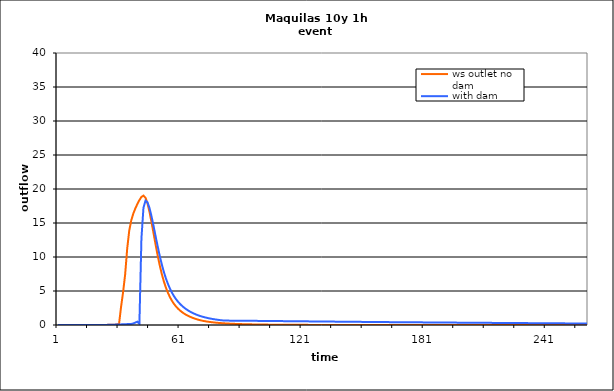
| Category | ws outlet no dam | with dam |
|---|---|---|
| 0 | 0 | 0 |
| 1 | 0 | 0 |
| 2 | 0 | 0 |
| 3 | 0 | 0 |
| 4 | 0 | 0 |
| 5 | 0 | 0 |
| 6 | 0 | 0 |
| 7 | 0 | 0 |
| 8 | 0 | 0 |
| 9 | 0 | 0 |
| 10 | 0 | 0 |
| 11 | 0 | 0 |
| 12 | 0 | 0 |
| 13 | 0 | 0 |
| 14 | 0 | 0 |
| 15 | 0 | 0 |
| 16 | 0 | 0 |
| 17 | 0 | 0 |
| 18 | 0 | 0 |
| 19 | 0 | 0 |
| 20 | 0 | 0 |
| 21 | 0 | 0 |
| 22 | 0.003 | 0.003 |
| 23 | 0.009 | 0.009 |
| 24 | 0.017 | 0.016 |
| 25 | 0.025 | 0.025 |
| 26 | 0.035 | 0.034 |
| 27 | 0.045 | 0.044 |
| 28 | 0.039 | 0.054 |
| 29 | 0.092 | 0.065 |
| 30 | 0.186 | 0.077 |
| 31 | 2.692 | 0.09 |
| 32 | 4.859 | 0.103 |
| 33 | 7.443 | 0.117 |
| 34 | 11.21 | 0.131 |
| 35 | 13.874 | 0.144 |
| 36 | 15.387 | 0.154 |
| 37 | 16.379 | 0.227 |
| 38 | 17.142 | 0.354 |
| 39 | 17.79 | 0.483 |
| 40 | 18.369 | 0.187 |
| 41 | 18.832 | 12.726 |
| 42 | 19.026 | 17.243 |
| 43 | 18.719 | 18.287 |
| 44 | 17.86 | 18.037 |
| 45 | 16.591 | 17.164 |
| 46 | 15.058 | 15.925 |
| 47 | 13.41 | 14.495 |
| 48 | 11.759 | 13.004 |
| 49 | 10.188 | 11.539 |
| 50 | 8.761 | 10.164 |
| 51 | 7.506 | 8.923 |
| 52 | 6.428 | 7.828 |
| 53 | 5.522 | 6.874 |
| 54 | 4.755 | 6.057 |
| 55 | 4.105 | 5.357 |
| 56 | 3.561 | 4.756 |
| 57 | 3.106 | 4.24 |
| 58 | 2.724 | 3.798 |
| 59 | 2.398 | 3.418 |
| 60 | 2.122 | 3.09 |
| 61 | 1.883 | 2.804 |
| 62 | 1.674 | 2.55 |
| 63 | 1.492 | 2.326 |
| 64 | 1.338 | 2.128 |
| 65 | 1.2 | 1.953 |
| 66 | 1.076 | 1.795 |
| 67 | 0.963 | 1.653 |
| 68 | 0.861 | 1.524 |
| 69 | 0.772 | 1.41 |
| 70 | 0.695 | 1.31 |
| 71 | 0.628 | 1.22 |
| 72 | 0.569 | 1.139 |
| 73 | 0.518 | 1.066 |
| 74 | 0.472 | 0.999 |
| 75 | 0.431 | 0.939 |
| 76 | 0.395 | 0.884 |
| 77 | 0.362 | 0.833 |
| 78 | 0.332 | 0.787 |
| 79 | 0.306 | 0.745 |
| 80 | 0.282 | 0.706 |
| 81 | 0.26 | 0.676 |
| 82 | 0.24 | 0.657 |
| 83 | 0.222 | 0.648 |
| 84 | 0.206 | 0.643 |
| 85 | 0.191 | 0.641 |
| 86 | 0.177 | 0.638 |
| 87 | 0.165 | 0.636 |
| 88 | 0.153 | 0.633 |
| 89 | 0.142 | 0.631 |
| 90 | 0.132 | 0.628 |
| 91 | 0.123 | 0.625 |
| 92 | 0.115 | 0.623 |
| 93 | 0.107 | 0.62 |
| 94 | 0.1 | 0.617 |
| 95 | 0.094 | 0.615 |
| 96 | 0.088 | 0.612 |
| 97 | 0.082 | 0.609 |
| 98 | 0.077 | 0.606 |
| 99 | 0.072 | 0.603 |
| 100 | 0.068 | 0.601 |
| 101 | 0.063 | 0.598 |
| 102 | 0.06 | 0.595 |
| 103 | 0.056 | 0.592 |
| 104 | 0.053 | 0.589 |
| 105 | 0.05 | 0.586 |
| 106 | 0.047 | 0.583 |
| 107 | 0.044 | 0.58 |
| 108 | 0.041 | 0.577 |
| 109 | 0.039 | 0.574 |
| 110 | 0.037 | 0.572 |
| 111 | 0.035 | 0.569 |
| 112 | 0.033 | 0.566 |
| 113 | 0.031 | 0.563 |
| 114 | 0.03 | 0.56 |
| 115 | 0.028 | 0.557 |
| 116 | 0.026 | 0.554 |
| 117 | 0.025 | 0.551 |
| 118 | 0.024 | 0.548 |
| 119 | 0.023 | 0.545 |
| 120 | 0.021 | 0.542 |
| 121 | 0.02 | 0.539 |
| 122 | 0.019 | 0.537 |
| 123 | 0.018 | 0.534 |
| 124 | 0.017 | 0.531 |
| 125 | 0.017 | 0.528 |
| 126 | 0.016 | 0.525 |
| 127 | 0.015 | 0.522 |
| 128 | 0.014 | 0.519 |
| 129 | 0.014 | 0.516 |
| 130 | 0.013 | 0.513 |
| 131 | 0.012 | 0.51 |
| 132 | 0.012 | 0.508 |
| 133 | 0.011 | 0.505 |
| 134 | 0.011 | 0.502 |
| 135 | 0.01 | 0.499 |
| 136 | 0.01 | 0.496 |
| 137 | 0.009 | 0.493 |
| 138 | 0.009 | 0.49 |
| 139 | 0.008 | 0.488 |
| 140 | 0.008 | 0.485 |
| 141 | 0.007 | 0.482 |
| 142 | 0.007 | 0.479 |
| 143 | 0.006 | 0.476 |
| 144 | 0.006 | 0.474 |
| 145 | 0.005 | 0.471 |
| 146 | 0.005 | 0.468 |
| 147 | 0.005 | 0.465 |
| 148 | 0.004 | 0.462 |
| 149 | 0.004 | 0.46 |
| 150 | 0.004 | 0.457 |
| 151 | 0.003 | 0.454 |
| 152 | 0.003 | 0.451 |
| 153 | 0.003 | 0.449 |
| 154 | 0.003 | 0.446 |
| 155 | 0.002 | 0.443 |
| 156 | 0.002 | 0.44 |
| 157 | 0.002 | 0.438 |
| 158 | 0.002 | 0.435 |
| 159 | 0.001 | 0.432 |
| 160 | 0.001 | 0.43 |
| 161 | 0.001 | 0.427 |
| 162 | 0.001 | 0.425 |
| 163 | 0.001 | 0.422 |
| 164 | 0.001 | 0.42 |
| 165 | 0.001 | 0.418 |
| 166 | 0.001 | 0.415 |
| 167 | 0.001 | 0.413 |
| 168 | 0.001 | 0.411 |
| 169 | 0 | 0.409 |
| 170 | 0 | 0.406 |
| 171 | 0 | 0.404 |
| 172 | 0 | 0.402 |
| 173 | 0 | 0.4 |
| 174 | 0 | 0.397 |
| 175 | 0 | 0.395 |
| 176 | 0 | 0.393 |
| 177 | 0 | 0.391 |
| 178 | 0 | 0.389 |
| 179 | 0 | 0.386 |
| 180 | 0 | 0.384 |
| 181 | 0 | 0.382 |
| 182 | 0 | 0.38 |
| 183 | 0 | 0.378 |
| 184 | 0 | 0.375 |
| 185 | 0 | 0.373 |
| 186 | 0 | 0.371 |
| 187 | 0 | 0.369 |
| 188 | 0 | 0.367 |
| 189 | 0 | 0.364 |
| 190 | 0 | 0.362 |
| 191 | 0 | 0.36 |
| 192 | 0 | 0.358 |
| 193 | 0 | 0.356 |
| 194 | 0 | 0.353 |
| 195 | 0 | 0.351 |
| 196 | 0 | 0.349 |
| 197 | 0 | 0.347 |
| 198 | 0 | 0.345 |
| 199 | 0 | 0.343 |
| 200 | 0 | 0.34 |
| 201 | 0 | 0.338 |
| 202 | 0 | 0.336 |
| 203 | 0 | 0.334 |
| 204 | 0 | 0.332 |
| 205 | 0 | 0.33 |
| 206 | 0 | 0.328 |
| 207 | 0 | 0.326 |
| 208 | 0 | 0.323 |
| 209 | 0 | 0.321 |
| 210 | 0 | 0.319 |
| 211 | 0 | 0.317 |
| 212 | 0 | 0.315 |
| 213 | 0 | 0.313 |
| 214 | 0 | 0.311 |
| 215 | 0 | 0.309 |
| 216 | 0 | 0.306 |
| 217 | 0 | 0.304 |
| 218 | 0 | 0.302 |
| 219 | 0 | 0.3 |
| 220 | 0 | 0.298 |
| 221 | 0 | 0.296 |
| 222 | 0 | 0.294 |
| 223 | 0 | 0.292 |
| 224 | 0 | 0.29 |
| 225 | 0 | 0.288 |
| 226 | 0 | 0.286 |
| 227 | 0 | 0.284 |
| 228 | 0 | 0.281 |
| 229 | 0 | 0.279 |
| 230 | 0 | 0.277 |
| 231 | 0 | 0.275 |
| 232 | 0 | 0.273 |
| 233 | 0 | 0.271 |
| 234 | 0 | 0.269 |
| 235 | 0 | 0.267 |
| 236 | 0 | 0.265 |
| 237 | 0 | 0.263 |
| 238 | 0 | 0.261 |
| 239 | 0 | 0.259 |
| 240 | 0 | 0.257 |
| 241 | 0 | 0.255 |
| 242 | 0 | 0.253 |
| 243 | 0 | 0.251 |
| 244 | 0 | 0.249 |
| 245 | 0 | 0.247 |
| 246 | 0 | 0.245 |
| 247 | 0 | 0.243 |
| 248 | 0 | 0.241 |
| 249 | 0 | 0.239 |
| 250 | 0 | 0.237 |
| 251 | 0 | 0.235 |
| 252 | 0 | 0.233 |
| 253 | 0 | 0.231 |
| 254 | 0 | 0.229 |
| 255 | 0 | 0.227 |
| 256 | 0 | 0.225 |
| 257 | 0 | 0.223 |
| 258 | 0 | 0.221 |
| 259 | 0 | 0.219 |
| 260 | 0 | 0.217 |